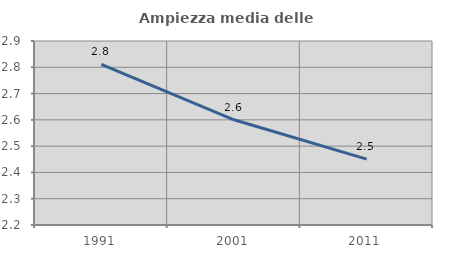
| Category | Ampiezza media delle famiglie |
|---|---|
| 1991.0 | 2.811 |
| 2001.0 | 2.6 |
| 2011.0 | 2.451 |